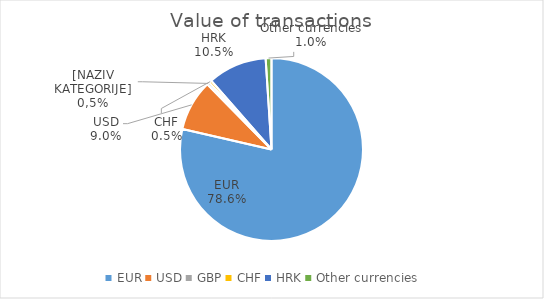
| Category | Value of transactions |
|---|---|
| EUR | 254659843051 |
| USD | 29234183194 |
| GBP | 1422746323 |
| CHF | 1573897991 |
| HRK | 33782729017 |
| Other currencies | 3320425771 |